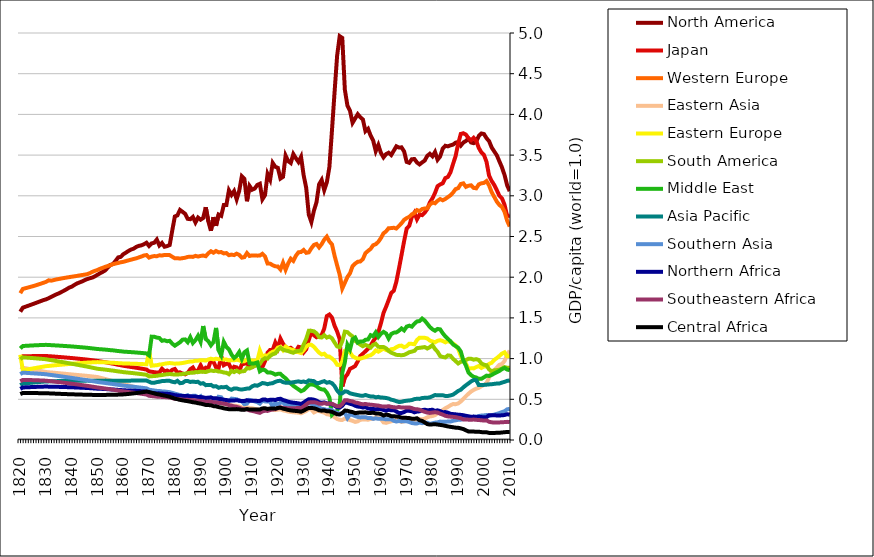
| Category | North America | Japan | Western Europe | Eastern Asia | Eastern Europe | South America | Middle East | Asia Pacific | Southern Asia | Northern Africa | Southeastern Africa | Central Africa |
|---|---|---|---|---|---|---|---|---|---|---|---|---|
| 1820.0 | 1.576 | 1.002 | 1.804 | 0.897 | 1.047 | 0.993 | 1.125 | 0.673 | 0.809 | 0.628 | 0.721 | 0.564 |
| 1821.0 | 1.626 | 1.028 | 1.856 | 0.887 | 0.857 | 1.015 | 1.155 | 0.693 | 0.827 | 0.645 | 0.738 | 0.578 |
| 1822.0 | 1.637 | 1.029 | 1.865 | 0.882 | 0.863 | 1.013 | 1.157 | 0.696 | 0.825 | 0.647 | 0.738 | 0.577 |
| 1823.0 | 1.648 | 1.029 | 1.873 | 0.876 | 0.868 | 1.011 | 1.158 | 0.699 | 0.823 | 0.648 | 0.737 | 0.577 |
| 1824.0 | 1.66 | 1.03 | 1.882 | 0.87 | 0.874 | 1.008 | 1.16 | 0.702 | 0.821 | 0.65 | 0.736 | 0.577 |
| 1825.0 | 1.671 | 1.031 | 1.89 | 0.865 | 0.88 | 1.006 | 1.162 | 0.705 | 0.819 | 0.651 | 0.735 | 0.576 |
| 1826.0 | 1.683 | 1.031 | 1.9 | 0.859 | 0.885 | 1.003 | 1.164 | 0.708 | 0.817 | 0.652 | 0.734 | 0.576 |
| 1827.0 | 1.695 | 1.032 | 1.91 | 0.853 | 0.891 | 1.001 | 1.165 | 0.711 | 0.815 | 0.653 | 0.733 | 0.576 |
| 1828.0 | 1.707 | 1.032 | 1.921 | 0.847 | 0.896 | 0.998 | 1.166 | 0.714 | 0.812 | 0.655 | 0.732 | 0.576 |
| 1829.0 | 1.719 | 1.033 | 1.932 | 0.841 | 0.902 | 0.995 | 1.168 | 0.717 | 0.81 | 0.656 | 0.73 | 0.575 |
| 1830.0 | 1.728 | 1.033 | 1.943 | 0.835 | 0.907 | 0.992 | 1.169 | 0.72 | 0.808 | 0.657 | 0.729 | 0.575 |
| 1831.0 | 1.741 | 1.029 | 1.962 | 0.832 | 0.909 | 0.986 | 1.166 | 0.72 | 0.803 | 0.655 | 0.725 | 0.573 |
| 1832.0 | 1.758 | 1.028 | 1.957 | 0.83 | 0.913 | 0.981 | 1.165 | 0.721 | 0.799 | 0.655 | 0.722 | 0.572 |
| 1833.0 | 1.774 | 1.025 | 1.965 | 0.827 | 0.916 | 0.976 | 1.163 | 0.722 | 0.794 | 0.654 | 0.718 | 0.57 |
| 1834.0 | 1.789 | 1.023 | 1.973 | 0.823 | 0.919 | 0.97 | 1.161 | 0.723 | 0.79 | 0.653 | 0.715 | 0.569 |
| 1835.0 | 1.802 | 1.02 | 1.978 | 0.821 | 0.922 | 0.965 | 1.16 | 0.724 | 0.785 | 0.653 | 0.711 | 0.568 |
| 1836.0 | 1.819 | 1.018 | 1.984 | 0.818 | 0.925 | 0.959 | 1.158 | 0.725 | 0.781 | 0.652 | 0.707 | 0.566 |
| 1837.0 | 1.835 | 1.015 | 1.99 | 0.815 | 0.928 | 0.954 | 1.156 | 0.726 | 0.776 | 0.651 | 0.703 | 0.565 |
| 1838.0 | 1.853 | 1.012 | 1.996 | 0.811 | 0.931 | 0.948 | 1.153 | 0.726 | 0.772 | 0.65 | 0.7 | 0.564 |
| 1839.0 | 1.872 | 1.01 | 2.001 | 0.808 | 0.934 | 0.942 | 1.151 | 0.727 | 0.767 | 0.649 | 0.696 | 0.563 |
| 1840.0 | 1.884 | 1.007 | 2.006 | 0.805 | 0.937 | 0.937 | 1.149 | 0.728 | 0.763 | 0.648 | 0.692 | 0.562 |
| 1841.0 | 1.905 | 1.004 | 2.011 | 0.802 | 0.939 | 0.931 | 1.147 | 0.728 | 0.758 | 0.646 | 0.687 | 0.56 |
| 1842.0 | 1.923 | 1.001 | 2.016 | 0.799 | 0.942 | 0.925 | 1.144 | 0.728 | 0.753 | 0.645 | 0.683 | 0.559 |
| 1843.0 | 1.935 | 0.997 | 2.022 | 0.797 | 0.944 | 0.919 | 1.141 | 0.729 | 0.748 | 0.643 | 0.679 | 0.558 |
| 1844.0 | 1.948 | 0.994 | 2.027 | 0.794 | 0.946 | 0.913 | 1.138 | 0.729 | 0.744 | 0.642 | 0.674 | 0.558 |
| 1845.0 | 1.964 | 0.991 | 2.032 | 0.791 | 0.949 | 0.907 | 1.136 | 0.729 | 0.739 | 0.64 | 0.67 | 0.557 |
| 1846.0 | 1.977 | 0.988 | 2.038 | 0.788 | 0.951 | 0.901 | 1.133 | 0.729 | 0.734 | 0.639 | 0.665 | 0.556 |
| 1847.0 | 1.987 | 0.984 | 2.05 | 0.784 | 0.953 | 0.895 | 1.129 | 0.729 | 0.729 | 0.637 | 0.66 | 0.555 |
| 1848.0 | 1.996 | 0.98 | 2.066 | 0.781 | 0.954 | 0.888 | 1.125 | 0.729 | 0.723 | 0.635 | 0.655 | 0.554 |
| 1849.0 | 2.012 | 0.975 | 2.079 | 0.777 | 0.955 | 0.881 | 1.122 | 0.728 | 0.718 | 0.633 | 0.65 | 0.554 |
| 1850.0 | 2.03 | 0.971 | 2.089 | 0.773 | 0.957 | 0.875 | 1.118 | 0.728 | 0.713 | 0.63 | 0.645 | 0.553 |
| 1851.0 | 2.049 | 0.966 | 2.104 | 0.765 | 0.956 | 0.871 | 1.115 | 0.728 | 0.709 | 0.629 | 0.641 | 0.553 |
| 1852.0 | 2.065 | 0.961 | 2.116 | 0.757 | 0.955 | 0.868 | 1.113 | 0.729 | 0.705 | 0.628 | 0.637 | 0.554 |
| 1853.0 | 2.084 | 0.955 | 2.128 | 0.749 | 0.954 | 0.865 | 1.11 | 0.729 | 0.701 | 0.626 | 0.632 | 0.554 |
| 1854.0 | 2.121 | 0.949 | 2.138 | 0.741 | 0.952 | 0.86 | 1.107 | 0.729 | 0.696 | 0.624 | 0.627 | 0.555 |
| 1855.0 | 2.151 | 0.943 | 2.148 | 0.732 | 0.95 | 0.856 | 1.104 | 0.729 | 0.692 | 0.622 | 0.623 | 0.555 |
| 1856.0 | 2.161 | 0.937 | 2.16 | 0.724 | 0.949 | 0.852 | 1.101 | 0.729 | 0.688 | 0.62 | 0.618 | 0.556 |
| 1857.0 | 2.201 | 0.931 | 2.168 | 0.716 | 0.947 | 0.848 | 1.097 | 0.729 | 0.683 | 0.618 | 0.613 | 0.557 |
| 1858.0 | 2.243 | 0.924 | 2.175 | 0.707 | 0.944 | 0.843 | 1.093 | 0.728 | 0.678 | 0.615 | 0.608 | 0.557 |
| 1859.0 | 2.25 | 0.918 | 2.183 | 0.699 | 0.943 | 0.839 | 1.09 | 0.728 | 0.673 | 0.614 | 0.603 | 0.559 |
| 1860.0 | 2.282 | 0.912 | 2.189 | 0.691 | 0.94 | 0.834 | 1.086 | 0.728 | 0.669 | 0.611 | 0.598 | 0.56 |
| 1861.0 | 2.301 | 0.907 | 2.198 | 0.681 | 0.94 | 0.831 | 1.084 | 0.728 | 0.665 | 0.61 | 0.594 | 0.563 |
| 1862.0 | 2.322 | 0.902 | 2.207 | 0.672 | 0.939 | 0.827 | 1.082 | 0.729 | 0.661 | 0.608 | 0.589 | 0.566 |
| 1863.0 | 2.34 | 0.897 | 2.215 | 0.662 | 0.938 | 0.824 | 1.08 | 0.729 | 0.658 | 0.607 | 0.585 | 0.569 |
| 1864.0 | 2.351 | 0.893 | 2.224 | 0.653 | 0.937 | 0.821 | 1.078 | 0.73 | 0.654 | 0.605 | 0.581 | 0.573 |
| 1865.0 | 2.372 | 0.887 | 2.232 | 0.644 | 0.936 | 0.817 | 1.075 | 0.73 | 0.65 | 0.604 | 0.577 | 0.577 |
| 1866.0 | 2.385 | 0.882 | 2.243 | 0.635 | 0.935 | 0.813 | 1.072 | 0.731 | 0.646 | 0.602 | 0.572 | 0.581 |
| 1867.0 | 2.391 | 0.877 | 2.254 | 0.626 | 0.933 | 0.81 | 1.07 | 0.731 | 0.643 | 0.6 | 0.568 | 0.585 |
| 1868.0 | 2.405 | 0.871 | 2.267 | 0.616 | 0.932 | 0.805 | 1.066 | 0.731 | 0.638 | 0.598 | 0.563 | 0.59 |
| 1869.0 | 2.423 | 0.866 | 2.272 | 0.607 | 0.93 | 0.801 | 1.063 | 0.731 | 0.634 | 0.596 | 0.559 | 0.595 |
| 1870.0 | 2.383 | 0.843 | 2.241 | 0.608 | 1.086 | 0.781 | 1.039 | 0.716 | 0.618 | 0.582 | 0.543 | 0.589 |
| 1871.0 | 2.415 | 0.838 | 2.253 | 0.602 | 0.912 | 0.784 | 1.27 | 0.702 | 0.613 | 0.579 | 0.54 | 0.581 |
| 1872.0 | 2.423 | 0.833 | 2.26 | 0.596 | 0.916 | 0.786 | 1.268 | 0.704 | 0.608 | 0.576 | 0.536 | 0.573 |
| 1873.0 | 2.462 | 0.828 | 2.258 | 0.589 | 0.919 | 0.788 | 1.258 | 0.711 | 0.603 | 0.573 | 0.533 | 0.564 |
| 1874.0 | 2.389 | 0.829 | 2.269 | 0.587 | 0.927 | 0.795 | 1.253 | 0.716 | 0.602 | 0.573 | 0.532 | 0.559 |
| 1875.0 | 2.42 | 0.877 | 2.267 | 0.58 | 0.93 | 0.797 | 1.219 | 0.724 | 0.597 | 0.57 | 0.528 | 0.551 |
| 1876.0 | 2.374 | 0.843 | 2.273 | 0.577 | 0.937 | 0.804 | 1.225 | 0.726 | 0.595 | 0.57 | 0.527 | 0.546 |
| 1877.0 | 2.382 | 0.854 | 2.272 | 0.572 | 0.942 | 0.807 | 1.213 | 0.727 | 0.592 | 0.567 | 0.525 | 0.539 |
| 1878.0 | 2.395 | 0.835 | 2.271 | 0.566 | 0.945 | 0.81 | 1.218 | 0.727 | 0.588 | 0.565 | 0.522 | 0.531 |
| 1879.0 | 2.574 | 0.862 | 2.251 | 0.556 | 0.942 | 0.807 | 1.183 | 0.715 | 0.579 | 0.558 | 0.515 | 0.52 |
| 1880.0 | 2.746 | 0.873 | 2.232 | 0.546 | 0.937 | 0.803 | 1.159 | 0.709 | 0.57 | 0.551 | 0.507 | 0.509 |
| 1881.0 | 2.76 | 0.828 | 2.233 | 0.54 | 0.94 | 0.806 | 1.18 | 0.727 | 0.561 | 0.548 | 0.504 | 0.501 |
| 1882.0 | 2.827 | 0.831 | 2.229 | 0.533 | 0.942 | 0.807 | 1.201 | 0.698 | 0.552 | 0.544 | 0.499 | 0.493 |
| 1883.0 | 2.803 | 0.816 | 2.234 | 0.528 | 0.946 | 0.81 | 1.233 | 0.702 | 0.545 | 0.541 | 0.497 | 0.487 |
| 1884.0 | 2.779 | 0.807 | 2.239 | 0.524 | 0.952 | 0.815 | 1.236 | 0.723 | 0.539 | 0.54 | 0.495 | 0.481 |
| 1885.0 | 2.717 | 0.824 | 2.249 | 0.521 | 0.959 | 0.821 | 1.201 | 0.725 | 0.55 | 0.539 | 0.493 | 0.477 |
| 1886.0 | 2.713 | 0.869 | 2.252 | 0.516 | 0.964 | 0.825 | 1.263 | 0.713 | 0.527 | 0.537 | 0.491 | 0.471 |
| 1887.0 | 2.74 | 0.891 | 2.249 | 0.51 | 0.966 | 0.827 | 1.191 | 0.718 | 0.542 | 0.534 | 0.487 | 0.464 |
| 1888.0 | 2.672 | 0.837 | 2.262 | 0.507 | 0.974 | 0.834 | 1.227 | 0.713 | 0.543 | 0.534 | 0.486 | 0.46 |
| 1889.0 | 2.732 | 0.854 | 2.254 | 0.5 | 0.974 | 0.834 | 1.28 | 0.715 | 0.519 | 0.529 | 0.482 | 0.452 |
| 1890.0 | 2.706 | 0.919 | 2.262 | 0.496 | 0.981 | 0.839 | 1.207 | 0.692 | 0.538 | 0.528 | 0.48 | 0.447 |
| 1891.0 | 2.728 | 0.856 | 2.266 | 0.49 | 0.981 | 0.839 | 1.4 | 0.698 | 0.48 | 0.524 | 0.476 | 0.44 |
| 1892.0 | 2.859 | 0.889 | 2.258 | 0.481 | 0.975 | 0.835 | 1.241 | 0.674 | 0.508 | 0.517 | 0.469 | 0.43 |
| 1893.0 | 2.687 | 0.885 | 2.294 | 0.481 | 0.989 | 0.846 | 1.214 | 0.676 | 0.52 | 0.52 | 0.471 | 0.429 |
| 1894.0 | 2.57 | 0.978 | 2.319 | 0.48 | 0.999 | 0.855 | 1.163 | 0.677 | 0.524 | 0.521 | 0.471 | 0.427 |
| 1895.0 | 2.737 | 0.959 | 2.301 | 0.469 | 0.99 | 0.848 | 1.203 | 0.658 | 0.499 | 0.512 | 0.463 | 0.416 |
| 1896.0 | 2.631 | 0.893 | 2.322 | 0.467 | 0.999 | 0.851 | 1.377 | 0.661 | 0.459 | 0.513 | 0.463 | 0.413 |
| 1897.0 | 2.77 | 0.883 | 2.305 | 0.458 | 0.992 | 0.841 | 1.102 | 0.641 | 0.531 | 0.505 | 0.456 | 0.404 |
| 1898.0 | 2.753 | 1.026 | 2.309 | 0.453 | 0.995 | 0.839 | 1.04 | 0.65 | 0.524 | 0.502 | 0.453 | 0.398 |
| 1899.0 | 2.886 | 0.919 | 2.292 | 0.444 | 0.987 | 0.829 | 1.205 | 0.648 | 0.472 | 0.495 | 0.445 | 0.389 |
| 1900.0 | 2.885 | 0.936 | 2.297 | 0.439 | 0.989 | 0.826 | 1.143 | 0.653 | 0.482 | 0.491 | 0.442 | 0.383 |
| 1901.0 | 3.067 | 0.934 | 2.27 | 0.429 | 0.977 | 0.809 | 1.112 | 0.628 | 0.477 | 0.485 | 0.428 | 0.378 |
| 1902.0 | 3.011 | 0.866 | 2.278 | 0.426 | 0.981 | 0.849 | 1.05 | 0.617 | 0.509 | 0.487 | 0.422 | 0.379 |
| 1903.0 | 3.058 | 0.9 | 2.271 | 0.42 | 0.978 | 0.834 | 1.007 | 0.634 | 0.505 | 0.485 | 0.412 | 0.377 |
| 1904.0 | 2.957 | 0.892 | 2.289 | 0.419 | 0.986 | 0.853 | 1.033 | 0.634 | 0.501 | 0.489 | 0.407 | 0.38 |
| 1905.0 | 3.063 | 0.851 | 2.274 | 0.412 | 0.979 | 0.835 | 1.08 | 0.623 | 0.479 | 0.485 | 0.397 | 0.377 |
| 1906.0 | 3.24 | 0.927 | 2.24 | 0.401 | 0.965 | 0.843 | 0.997 | 0.62 | 0.476 | 0.478 | 0.383 | 0.371 |
| 1907.0 | 3.207 | 0.937 | 2.247 | 0.398 | 0.968 | 0.847 | 1.077 | 0.625 | 0.44 | 0.479 | 0.376 | 0.372 |
| 1908.0 | 2.933 | 0.941 | 2.297 | 0.402 | 0.99 | 0.883 | 1.1 | 0.632 | 0.448 | 0.489 | 0.377 | 0.38 |
| 1909.0 | 3.121 | 0.902 | 2.261 | 0.392 | 0.975 | 0.878 | 0.941 | 0.634 | 0.492 | 0.481 | 0.364 | 0.374 |
| 1910.0 | 3.075 | 0.895 | 2.268 | 0.389 | 0.978 | 0.896 | 0.941 | 0.659 | 0.484 | 0.483 | 0.358 | 0.376 |
| 1911.0 | 3.089 | 0.918 | 2.267 | 0.382 | 0.976 | 0.91 | 0.942 | 0.672 | 0.474 | 0.482 | 0.35 | 0.376 |
| 1912.0 | 3.133 | 0.921 | 2.265 | 0.375 | 0.972 | 0.921 | 0.953 | 0.667 | 0.465 | 0.48 | 0.342 | 0.375 |
| 1913.0 | 3.148 | 0.909 | 2.267 | 0.369 | 1.1 | 0.934 | 0.844 | 0.682 | 0.447 | 0.479 | 0.334 | 0.375 |
| 1914.0 | 2.957 | 0.897 | 2.287 | 0.38 | 1.019 | 0.983 | 0.864 | 0.7 | 0.485 | 0.496 | 0.352 | 0.388 |
| 1915.0 | 3.008 | 0.967 | 2.256 | 0.381 | 1.04 | 1.005 | 0.858 | 0.695 | 0.473 | 0.498 | 0.359 | 0.39 |
| 1916.0 | 3.268 | 1.072 | 2.167 | 0.371 | 1.033 | 1 | 0.829 | 0.686 | 0.474 | 0.487 | 0.357 | 0.381 |
| 1917.0 | 3.199 | 1.107 | 2.167 | 0.375 | 1.065 | 1.033 | 0.831 | 0.694 | 0.469 | 0.494 | 0.368 | 0.387 |
| 1918.0 | 3.404 | 1.107 | 2.147 | 0.373 | 1.085 | 1.054 | 0.821 | 0.698 | 0.408 | 0.495 | 0.375 | 0.388 |
| 1919.0 | 3.357 | 1.197 | 2.133 | 0.368 | 1.093 | 1.063 | 0.803 | 0.714 | 0.458 | 0.492 | 0.378 | 0.385 |
| 1920.0 | 3.343 | 1.131 | 2.132 | 0.372 | 1.135 | 1.105 | 0.813 | 0.725 | 0.429 | 0.502 | 0.392 | 0.394 |
| 1921.0 | 3.212 | 1.245 | 2.095 | 0.376 | 1.145 | 1.132 | 0.813 | 0.728 | 0.461 | 0.507 | 0.401 | 0.397 |
| 1922.0 | 3.233 | 1.182 | 2.177 | 0.364 | 1.104 | 1.11 | 0.782 | 0.711 | 0.459 | 0.491 | 0.395 | 0.385 |
| 1923.0 | 3.494 | 1.142 | 2.091 | 0.358 | 1.148 | 1.099 | 0.758 | 0.704 | 0.429 | 0.482 | 0.393 | 0.378 |
| 1924.0 | 3.426 | 1.126 | 2.17 | 0.349 | 1.128 | 1.093 | 0.723 | 0.703 | 0.433 | 0.471 | 0.389 | 0.369 |
| 1925.0 | 3.403 | 1.133 | 2.227 | 0.344 | 1.113 | 1.08 | 0.693 | 0.705 | 0.425 | 0.464 | 0.389 | 0.364 |
| 1926.0 | 3.512 | 1.106 | 2.2 | 0.34 | 1.108 | 1.072 | 0.666 | 0.71 | 0.427 | 0.458 | 0.389 | 0.36 |
| 1927.0 | 3.461 | 1.091 | 2.264 | 0.338 | 1.086 | 1.09 | 0.643 | 0.715 | 0.417 | 0.454 | 0.392 | 0.357 |
| 1928.0 | 3.415 | 1.145 | 2.306 | 0.335 | 1.078 | 1.094 | 0.622 | 0.72 | 0.411 | 0.45 | 0.393 | 0.353 |
| 1929.0 | 3.478 | 1.138 | 2.31 | 0.328 | 1.068 | 1.099 | 0.6 | 0.712 | 0.414 | 0.442 | 0.391 | 0.347 |
| 1930.0 | 3.253 | 1.076 | 2.334 | 0.343 | 1.103 | 1.173 | 0.613 | 0.719 | 0.428 | 0.46 | 0.412 | 0.361 |
| 1931.0 | 3.098 | 1.114 | 2.299 | 0.358 | 1.147 | 1.242 | 0.645 | 0.708 | 0.437 | 0.482 | 0.437 | 0.379 |
| 1932.0 | 2.769 | 1.231 | 2.305 | 0.38 | 1.17 | 1.341 | 0.677 | 0.732 | 0.451 | 0.501 | 0.46 | 0.394 |
| 1933.0 | 2.678 | 1.323 | 2.355 | 0.376 | 1.169 | 1.341 | 0.683 | 0.727 | 0.442 | 0.501 | 0.465 | 0.394 |
| 1934.0 | 2.818 | 1.287 | 2.397 | 0.339 | 1.145 | 1.335 | 0.677 | 0.723 | 0.433 | 0.495 | 0.465 | 0.39 |
| 1935.0 | 2.921 | 1.262 | 2.408 | 0.355 | 1.107 | 1.31 | 0.663 | 0.698 | 0.41 | 0.483 | 0.459 | 0.38 |
| 1936.0 | 3.141 | 1.276 | 2.366 | 0.358 | 1.073 | 1.264 | 0.635 | 0.7 | 0.402 | 0.464 | 0.446 | 0.365 |
| 1937.0 | 3.195 | 1.291 | 2.407 | 0.344 | 1.051 | 1.259 | 0.622 | 0.713 | 0.382 | 0.458 | 0.444 | 0.36 |
| 1938.0 | 3.069 | 1.37 | 2.461 | 0.336 | 1.06 | 1.288 | 0.619 | 0.723 | 0.379 | 0.462 | 0.453 | 0.364 |
| 1939.0 | 3.164 | 1.522 | 2.498 | 0.317 | 1.028 | 1.258 | 0.583 | 0.703 | 0.369 | 0.449 | 0.445 | 0.353 |
| 1940.0 | 3.354 | 1.542 | 2.439 | 0.311 | 1.025 | 1.271 | 0.523 | 0.711 | 0.373 | 0.448 | 0.449 | 0.353 |
| 1941.0 | 3.804 | 1.504 | 2.403 | 0.299 | 1.002 | 1.249 | 0.31 | 0.697 | 0.366 | 0.44 | 0.445 | 0.346 |
| 1942.0 | 4.27 | 1.405 | 2.265 | 0.28 | 0.974 | 1.198 | 0.341 | 0.664 | 0.343 | 0.421 | 0.43 | 0.332 |
| 1943.0 | 4.721 | 1.333 | 2.145 | 0.258 | 0.924 | 1.15 | 0.357 | 0.608 | 0.334 | 0.402 | 0.414 | 0.316 |
| 1944.0 | 4.961 | 1.238 | 2.03 | 0.248 | 0.919 | 1.14 | 0.442 | 0.572 | 0.322 | 0.398 | 0.414 | 0.313 |
| 1945.0 | 4.94 | 0.658 | 1.861 | 0.246 | 0.964 | 1.214 | 0.828 | 0.574 | 0.329 | 0.421 | 0.442 | 0.331 |
| 1946.0 | 4.304 | 0.769 | 1.932 | 0.264 | 1.095 | 1.331 | 0.954 | 0.598 | 0.335 | 0.461 | 0.488 | 0.362 |
| 1947.0 | 4.108 | 0.807 | 2.003 | 0.256 | 1.099 | 1.325 | 1.17 | 0.593 | 0.269 | 0.456 | 0.488 | 0.359 |
| 1948.0 | 4.044 | 0.875 | 2.048 | 0.244 | 1.075 | 1.296 | 1.113 | 0.573 | 0.317 | 0.445 | 0.479 | 0.349 |
| 1949.0 | 3.897 | 0.89 | 2.136 | 0.235 | 1.03 | 1.273 | 1.238 | 0.565 | 0.307 | 0.437 | 0.474 | 0.343 |
| 1950.0 | 3.95 | 0.909 | 2.167 | 0.222 | 1.011 | 1.218 | 1.258 | 0.558 | 0.294 | 0.42 | 0.46 | 0.33 |
| 1951.0 | 4.002 | 0.967 | 2.19 | 0.229 | 1 | 1.196 | 1.196 | 0.552 | 0.283 | 0.411 | 0.456 | 0.334 |
| 1952.0 | 3.965 | 1.033 | 2.194 | 0.248 | 1 | 1.171 | 1.21 | 0.545 | 0.277 | 0.407 | 0.445 | 0.339 |
| 1953.0 | 3.938 | 1.06 | 2.222 | 0.252 | 1.01 | 1.152 | 1.209 | 0.543 | 0.28 | 0.399 | 0.438 | 0.338 |
| 1954.0 | 3.794 | 1.09 | 2.296 | 0.252 | 1.018 | 1.168 | 1.231 | 0.553 | 0.281 | 0.404 | 0.443 | 0.34 |
| 1955.0 | 3.823 | 1.121 | 2.323 | 0.249 | 1.034 | 1.155 | 1.235 | 0.543 | 0.269 | 0.387 | 0.436 | 0.333 |
| 1956.0 | 3.74 | 1.161 | 2.348 | 0.259 | 1.041 | 1.135 | 1.288 | 0.535 | 0.271 | 0.382 | 0.434 | 0.332 |
| 1957.0 | 3.678 | 1.214 | 2.393 | 0.262 | 1.063 | 1.169 | 1.275 | 0.535 | 0.26 | 0.381 | 0.431 | 0.335 |
| 1958.0 | 3.549 | 1.259 | 2.406 | 0.28 | 1.1 | 1.181 | 1.322 | 0.524 | 0.267 | 0.377 | 0.426 | 0.327 |
| 1959.0 | 3.624 | 1.325 | 2.435 | 0.275 | 1.085 | 1.145 | 1.265 | 0.53 | 0.261 | 0.382 | 0.423 | 0.326 |
| 1960.0 | 3.527 | 1.434 | 2.481 | 0.258 | 1.103 | 1.142 | 1.304 | 0.521 | 0.263 | 0.378 | 0.415 | 0.319 |
| 1961.0 | 3.472 | 1.56 | 2.539 | 0.217 | 1.124 | 1.143 | 1.328 | 0.52 | 0.26 | 0.369 | 0.411 | 0.301 |
| 1962.0 | 3.512 | 1.636 | 2.563 | 0.211 | 1.106 | 1.126 | 1.309 | 0.516 | 0.253 | 0.359 | 0.41 | 0.311 |
| 1963.0 | 3.529 | 1.719 | 2.602 | 0.221 | 1.098 | 1.094 | 1.247 | 0.509 | 0.255 | 0.372 | 0.415 | 0.307 |
| 1964.0 | 3.501 | 1.806 | 2.603 | 0.229 | 1.116 | 1.072 | 1.302 | 0.495 | 0.254 | 0.365 | 0.407 | 0.293 |
| 1965.0 | 3.554 | 1.834 | 2.608 | 0.241 | 1.119 | 1.06 | 1.319 | 0.488 | 0.236 | 0.367 | 0.402 | 0.292 |
| 1966.0 | 3.608 | 1.946 | 2.598 | 0.248 | 1.14 | 1.046 | 1.322 | 0.476 | 0.227 | 0.35 | 0.399 | 0.288 |
| 1967.0 | 3.593 | 2.105 | 2.629 | 0.235 | 1.157 | 1.044 | 1.343 | 0.467 | 0.233 | 0.332 | 0.405 | 0.285 |
| 1968.0 | 3.595 | 2.272 | 2.663 | 0.222 | 1.159 | 1.041 | 1.371 | 0.469 | 0.229 | 0.332 | 0.399 | 0.275 |
| 1969.0 | 3.545 | 2.442 | 2.704 | 0.23 | 1.14 | 1.046 | 1.347 | 0.478 | 0.23 | 0.343 | 0.398 | 0.274 |
| 1970.0 | 3.416 | 2.598 | 2.726 | 0.241 | 1.153 | 1.06 | 1.393 | 0.482 | 0.23 | 0.36 | 0.398 | 0.272 |
| 1971.0 | 3.405 | 2.631 | 2.742 | 0.25 | 1.183 | 1.078 | 1.404 | 0.486 | 0.221 | 0.359 | 0.4 | 0.27 |
| 1972.0 | 3.45 | 2.74 | 2.772 | 0.247 | 1.181 | 1.086 | 1.393 | 0.491 | 0.209 | 0.354 | 0.392 | 0.262 |
| 1973.0 | 3.451 | 2.792 | 2.788 | 0.25 | 1.176 | 1.095 | 1.428 | 0.502 | 0.204 | 0.34 | 0.38 | 0.261 |
| 1974.0 | 3.409 | 2.711 | 2.824 | 0.249 | 1.228 | 1.129 | 1.457 | 0.507 | 0.203 | 0.349 | 0.379 | 0.267 |
| 1975.0 | 3.386 | 2.768 | 2.812 | 0.26 | 1.257 | 1.132 | 1.461 | 0.505 | 0.214 | 0.352 | 0.372 | 0.242 |
| 1976.0 | 3.41 | 2.763 | 2.837 | 0.253 | 1.256 | 1.137 | 1.492 | 0.516 | 0.207 | 0.367 | 0.358 | 0.234 |
| 1977.0 | 3.433 | 2.792 | 2.845 | 0.262 | 1.255 | 1.142 | 1.467 | 0.518 | 0.211 | 0.372 | 0.346 | 0.216 |
| 1978.0 | 3.491 | 2.838 | 2.847 | 0.278 | 1.248 | 1.124 | 1.429 | 0.519 | 0.213 | 0.364 | 0.337 | 0.196 |
| 1979.0 | 3.517 | 2.918 | 2.891 | 0.29 | 1.221 | 1.141 | 1.388 | 0.525 | 0.198 | 0.368 | 0.332 | 0.189 |
| 1980.0 | 3.485 | 2.969 | 2.918 | 0.294 | 1.21 | 1.165 | 1.36 | 0.537 | 0.206 | 0.372 | 0.338 | 0.192 |
| 1981.0 | 3.538 | 3.034 | 2.908 | 0.305 | 1.2 | 1.118 | 1.342 | 0.552 | 0.213 | 0.357 | 0.341 | 0.194 |
| 1982.0 | 3.443 | 3.118 | 2.939 | 0.328 | 1.219 | 1.084 | 1.364 | 0.549 | 0.217 | 0.364 | 0.337 | 0.19 |
| 1983.0 | 3.483 | 3.14 | 2.961 | 0.345 | 1.226 | 1.031 | 1.359 | 0.551 | 0.226 | 0.355 | 0.323 | 0.185 |
| 1984.0 | 3.58 | 3.154 | 2.945 | 0.369 | 1.217 | 1.02 | 1.312 | 0.55 | 0.224 | 0.341 | 0.312 | 0.181 |
| 1985.0 | 3.615 | 3.217 | 2.961 | 0.39 | 1.2 | 1.014 | 1.273 | 0.541 | 0.225 | 0.343 | 0.298 | 0.174 |
| 1986.0 | 3.608 | 3.232 | 2.984 | 0.406 | 1.215 | 1.039 | 1.243 | 0.541 | 0.226 | 0.336 | 0.29 | 0.167 |
| 1987.0 | 3.62 | 3.288 | 3.006 | 0.427 | 1.202 | 1.035 | 1.213 | 0.548 | 0.227 | 0.322 | 0.287 | 0.161 |
| 1988.0 | 3.629 | 3.39 | 3.039 | 0.442 | 1.186 | 0.998 | 1.174 | 0.557 | 0.236 | 0.318 | 0.284 | 0.157 |
| 1989.0 | 3.653 | 3.488 | 3.082 | 0.44 | 1.162 | 0.969 | 1.154 | 0.579 | 0.242 | 0.315 | 0.281 | 0.152 |
| 1990.0 | 3.66 | 3.641 | 3.094 | 0.449 | 1.119 | 0.94 | 1.133 | 0.603 | 0.248 | 0.311 | 0.274 | 0.15 |
| 1991.0 | 3.617 | 3.76 | 3.145 | 0.473 | 1.035 | 0.961 | 1.088 | 0.618 | 0.25 | 0.308 | 0.267 | 0.143 |
| 1992.0 | 3.654 | 3.769 | 3.153 | 0.504 | 0.972 | 0.968 | 0.977 | 0.647 | 0.257 | 0.304 | 0.253 | 0.134 |
| 1993.0 | 3.674 | 3.752 | 3.11 | 0.539 | 0.939 | 0.983 | 0.914 | 0.672 | 0.264 | 0.297 | 0.253 | 0.119 |
| 1994.0 | 3.702 | 3.707 | 3.124 | 0.568 | 0.875 | 0.998 | 0.829 | 0.695 | 0.271 | 0.291 | 0.25 | 0.105 |
| 1995.0 | 3.655 | 3.683 | 3.129 | 0.595 | 0.881 | 0.998 | 0.797 | 0.72 | 0.278 | 0.285 | 0.249 | 0.105 |
| 1996.0 | 3.647 | 3.712 | 3.097 | 0.615 | 0.88 | 0.987 | 0.776 | 0.737 | 0.285 | 0.288 | 0.251 | 0.103 |
| 1997.0 | 3.666 | 3.675 | 3.092 | 0.631 | 0.896 | 0.993 | 0.768 | 0.734 | 0.286 | 0.283 | 0.248 | 0.102 |
| 1998.0 | 3.735 | 3.587 | 3.14 | 0.641 | 0.908 | 0.982 | 0.751 | 0.675 | 0.294 | 0.285 | 0.245 | 0.101 |
| 1999.0 | 3.766 | 3.533 | 3.153 | 0.661 | 0.886 | 0.941 | 0.752 | 0.676 | 0.301 | 0.282 | 0.243 | 0.097 |
| 2000.0 | 3.758 | 3.502 | 3.158 | 0.677 | 0.903 | 0.925 | 0.77 | 0.677 | 0.302 | 0.278 | 0.238 | 0.094 |
| 2001.0 | 3.708 | 3.417 | 3.181 | 0.697 | 0.905 | 0.919 | 0.791 | 0.68 | 0.307 | 0.281 | 0.241 | 0.095 |
| 2002.0 | 3.671 | 3.246 | 3.127 | 0.77 | 0.935 | 0.867 | 0.787 | 0.683 | 0.298 | 0.305 | 0.224 | 0.087 |
| 2003.0 | 3.594 | 3.182 | 3.044 | 0.833 | 0.949 | 0.844 | 0.799 | 0.685 | 0.305 | 0.305 | 0.217 | 0.085 |
| 2004.0 | 3.545 | 3.133 | 2.986 | 0.859 | 0.984 | 0.855 | 0.817 | 0.69 | 0.312 | 0.304 | 0.215 | 0.087 |
| 2005.0 | 3.497 | 3.068 | 2.929 | 0.89 | 1.007 | 0.859 | 0.832 | 0.693 | 0.321 | 0.301 | 0.216 | 0.088 |
| 2006.0 | 3.423 | 3 | 2.887 | 0.923 | 1.033 | 0.863 | 0.849 | 0.694 | 0.331 | 0.301 | 0.216 | 0.089 |
| 2007.0 | 3.349 | 2.969 | 2.862 | 0.933 | 1.062 | 0.88 | 0.871 | 0.706 | 0.343 | 0.303 | 0.218 | 0.092 |
| 2008.0 | 3.255 | 2.889 | 2.803 | 0.971 | 1.077 | 0.895 | 0.885 | 0.714 | 0.353 | 0.307 | 0.22 | 0.096 |
| 2009.0 | 3.128 | 2.751 | 2.694 | 1.047 | 1.029 | 0.888 | 0.866 | 0.727 | 0.377 | 0.317 | 0.223 | 0.099 |
| 2010.0 | 3.057 | 2.755 | 2.623 | 1.097 | 1.029 | 0.889 | 0.858 | 0.731 | 0.383 | 0.311 | 0.219 | 0.098 |